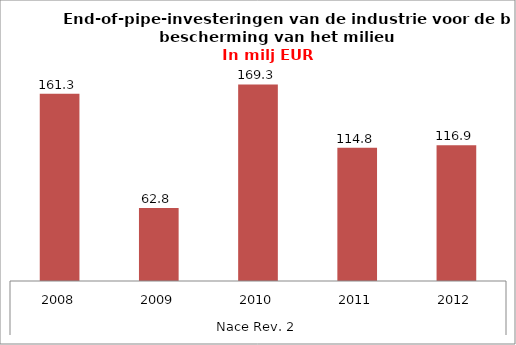
| Category | Totaal industrie |
|---|---|
| 0 | 161.3 |
| 1 | 62.8 |
| 2 | 169.3 |
| 3 | 114.8 |
| 4 | 116.918 |